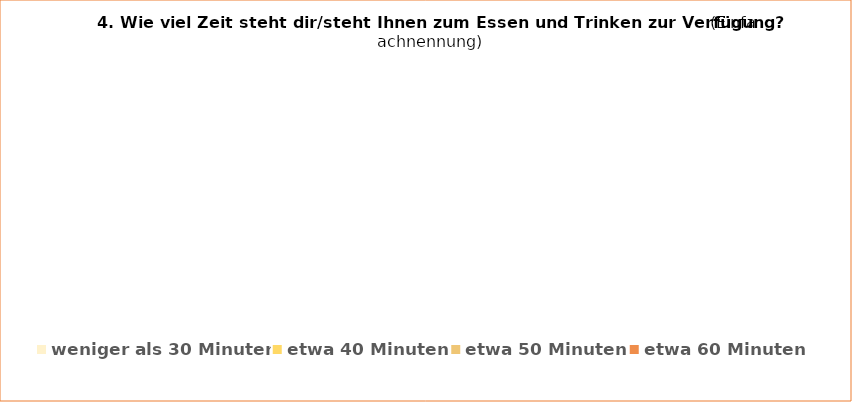
| Category | Series 0 | Series 1 |
|---|---|---|
| weniger als 30 Minuten |  | 0 |
| etwa 40 Minuten |  | 0 |
| etwa 50 Minuten |  | 0 |
| etwa 60 Minuten |  | 0 |